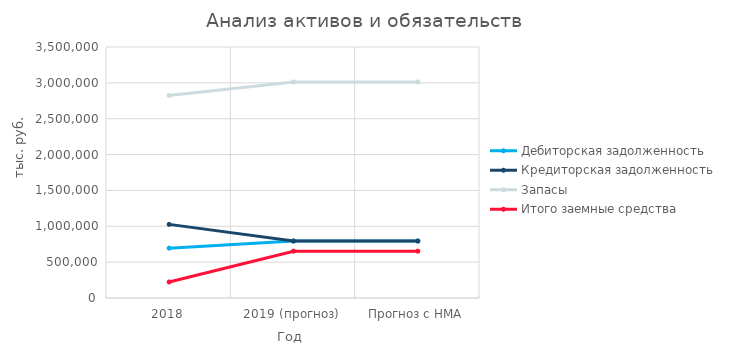
| Category | Дебиторская задолженность | Кредиторская задолженность | Запасы | Итого заемные средства |
|---|---|---|---|---|
| 2018 | 695340 | 1026550 | 2825074 | 223500 |
| 2019 (прогноз) | 796373 | 793415 | 3012931 | 652935 |
| Прогноз с НМА | 796373 | 793415 | 3012931 | 652935 |